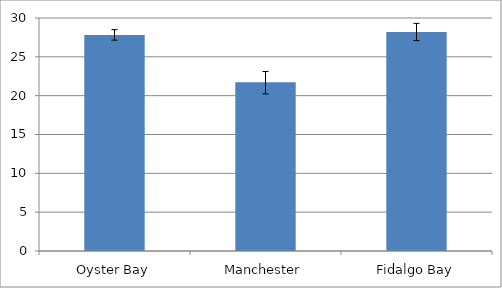
| Category | Series 0 |
|---|---|
| Oyster Bay | 27.808 |
| Manchester | 21.731 |
| Fidalgo Bay | 28.182 |